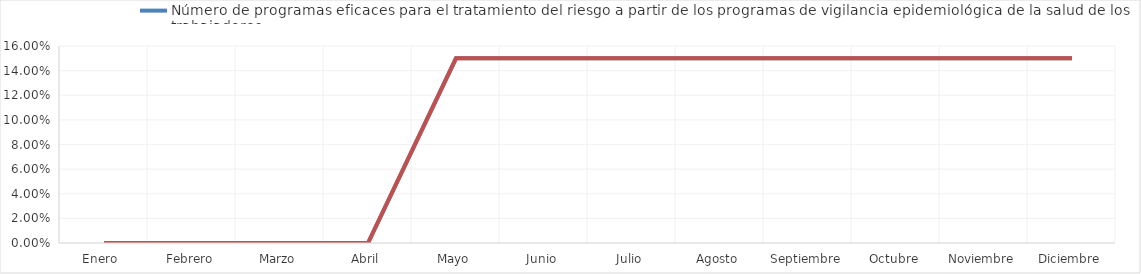
| Category | Número de programas eficaces para el tratamiento del riesgo a partir de los programas de vigilancia epidemiológica de la salud de los trabajadores | Número de programas para el tratamiento del riesgo a partir de los programas de vigilancia epidemiológica de la salud de los trabajadores |
|---|---|---|
| Enero  | 0 | 0 |
| Febrero | 0 | 0 |
| Marzo | 0 | 0 |
| Abril | 0 | 0 |
| Mayo | 0.15 | 0.15 |
| Junio | 0.15 | 0.15 |
| Julio | 0.15 | 0.15 |
| Agosto | 0.15 | 0.15 |
| Septiembre | 0.15 | 0.15 |
| Octubre | 0.15 | 0.15 |
| Noviembre | 0.15 | 0.15 |
| Diciembre | 0.15 | 0.15 |